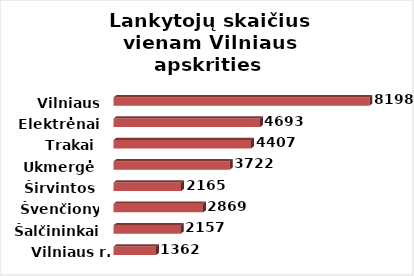
| Category | Series 0 |
|---|---|
| Vilniaus r. | 1361.607 |
| Šalčininkai | 2156.762 |
| Švenčionys | 2868.725 |
| Širvintos | 2164.6 |
| Ukmergė | 3722 |
| Trakai | 4406.944 |
| Elektrėnai | 4693.414 |
| Vilniaus m. | 8197.958 |